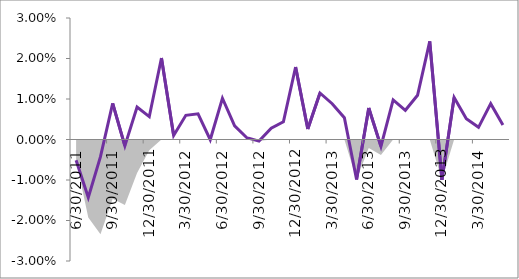
| Category | Series 1 |
|---|---|
| 0 | -0.005 |
| 01/01/1900 | -0.014 |
| 02/01/1900 | -0.004 |
| 03/01/1900 | 0.009 |
| 04/01/1900 | -0.002 |
| 05/01/1900 | 0.008 |
| 06/01/1900 | 0.006 |
| 07/01/1900 | 0.02 |
| 08/01/1900 | 0.001 |
| 09/01/1900 | 0.006 |
| 10/01/1900 | 0.006 |
| 11/01/1900 | 0 |
| 12/01/1900 | 0.01 |
| 13/01/1900 | 0.003 |
| 14/01/1900 | 0 |
| 15/01/1900 | 0 |
| 16/01/1900 | 0.003 |
| 17/01/1900 | 0.004 |
| 18/01/1900 | 0.018 |
| 19/01/1900 | 0.003 |
| 20/01/1900 | 0.011 |
| 21/01/1900 | 0.009 |
| 22/01/1900 | 0.005 |
| 23/01/1900 | -0.01 |
| 24/01/1900 | 0.008 |
| 25/01/1900 | -0.002 |
| 26/01/1900 | 0.01 |
| 27/01/1900 | 0.007 |
| 28/01/1900 | 0.011 |
| 29/01/1900 | 0.024 |
| 30/01/1900 | -0.01 |
| 31/01/1900 | 0.01 |
| 01/02/1900 | 0.005 |
| 02/02/1900 | 0.003 |
| 03/02/1900 | 0.009 |
| 04/02/1900 | 0.004 |